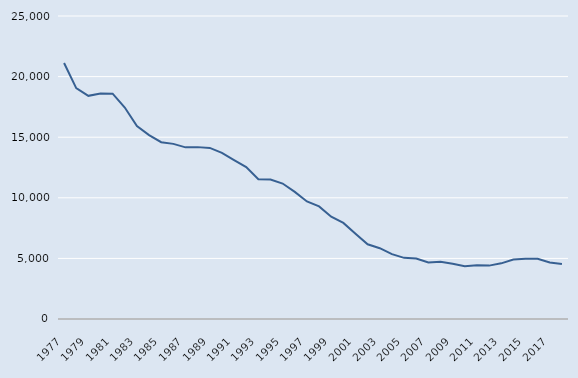
| Category | Series 1 |
|---|---|
| 1977.0 | 21127 |
| 1978.0 | 19050 |
| 1979.0 | 18412 |
| 1980.0 | 18612 |
| 1981.0 | 18588 |
| 1982.0 | 17446 |
| 1983.0 | 15921 |
| 1984.0 | 15175 |
| 1985.0 | 14587 |
| 1986.0 | 14450 |
| 1987.0 | 14163 |
| 1988.0 | 14181 |
| 1989.0 | 14118 |
| 1990.0 | 13704 |
| 1991.0 | 13108 |
| 1992.0 | 12538 |
| 1993.0 | 11530 |
| 1994.0 | 11514 |
| 1995.0 | 11177 |
| 1996.0 | 10485 |
| 1997.0 | 9696 |
| 1998.0 | 9292 |
| 1999.0 | 8437 |
| 2000.0 | 7930 |
| 2001.0 | 7035 |
| 2002.0 | 6168 |
| 2003.0 | 5843 |
| 2004.0 | 5352 |
| 2005.0 | 5045 |
| 2006.0 | 4984 |
| 2007.0 | 4659 |
| 2008.0 | 4721 |
| 2009.0 | 4550 |
| 2010.0 | 4350 |
| 2011.0 | 4430 |
| 2012.0 | 4405 |
| 2013.0 | 4593 |
| 2014.0 | 4903 |
| 2015.0 | 4964 |
| 2016.0 | 4967 |
| 2017.0 | 4657 |
| 2018.0 | 4545 |